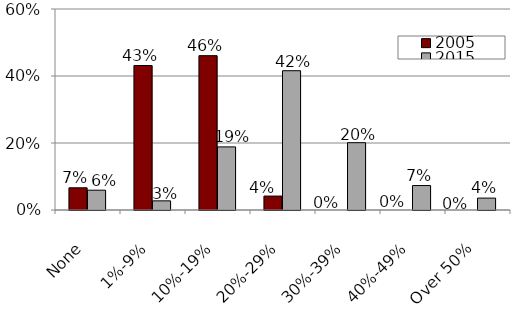
| Category | 2005 | 2015 |
|---|---|---|
| None | 0.066 | 0.059 |
| 1%-9% | 0.431 | 0.027 |
| 10%-19% | 0.461 | 0.188 |
| 20%-29% | 0.042 | 0.416 |
| 30%-39% | 0 | 0.201 |
| 40%-49% | 0 | 0.073 |
| Over 50% | 0 | 0.036 |